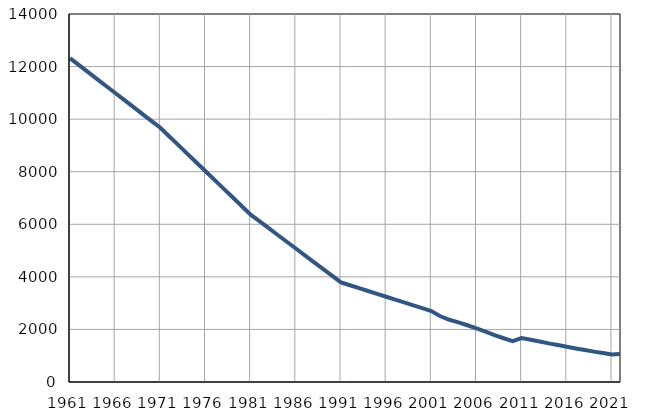
| Category | Population
size |
|---|---|
| 1961.0 | 12319 |
| 1962.0 | 12054 |
| 1963.0 | 11790 |
| 1964.0 | 11525 |
| 1965.0 | 11260 |
| 1966.0 | 10996 |
| 1967.0 | 10731 |
| 1968.0 | 10466 |
| 1969.0 | 10201 |
| 1970.0 | 9937 |
| 1971.0 | 9672 |
| 1972.0 | 9341 |
| 1973.0 | 9011 |
| 1974.0 | 8680 |
| 1975.0 | 8350 |
| 1976.0 | 8019 |
| 1977.0 | 7688 |
| 1978.0 | 7358 |
| 1979.0 | 7027 |
| 1980.0 | 6697 |
| 1981.0 | 6366 |
| 1982.0 | 6108 |
| 1983.0 | 5851 |
| 1984.0 | 5593 |
| 1985.0 | 5335 |
| 1986.0 | 5078 |
| 1987.0 | 4820 |
| 1988.0 | 4562 |
| 1989.0 | 4304 |
| 1990.0 | 4047 |
| 1991.0 | 3789 |
| 1992.0 | 3680 |
| 1993.0 | 3571 |
| 1994.0 | 3462 |
| 1995.0 | 3353 |
| 1996.0 | 3244 |
| 1997.0 | 3135 |
| 1998.0 | 3026 |
| 1999.0 | 2917 |
| 2000.0 | 2808 |
| 2001.0 | 2699 |
| 2002.0 | 2501 |
| 2003.0 | 2367 |
| 2004.0 | 2267 |
| 2005.0 | 2159 |
| 2006.0 | 2041 |
| 2007.0 | 1915 |
| 2008.0 | 1782 |
| 2009.0 | 1664 |
| 2010.0 | 1551 |
| 2011.0 | 1673 |
| 2012.0 | 1608 |
| 2013.0 | 1539 |
| 2014.0 | 1470 |
| 2015.0 | 1409 |
| 2016.0 | 1339 |
| 2017.0 | 1278 |
| 2018.0 | 1219 |
| 2019.0 | 1156 |
| 2020.0 | 1100 |
| 2021.0 | 1046 |
| 2022.0 | 1066 |